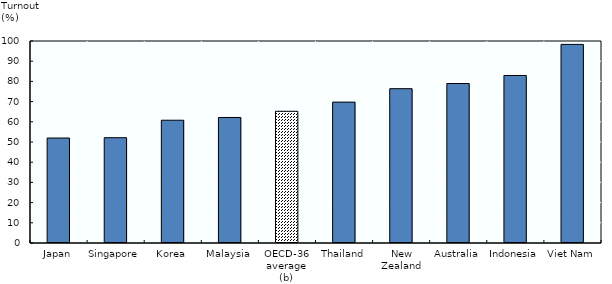
| Category | Series 1 |
|---|---|
| Japan | 51.97 |
| Singapore | 52.13 |
| Korea | 60.78 |
| Malaysia | 62.14 |
| OECD-36 average (b) | 65.2 |
| Thailand | 69.75 |
| New Zealand | 76.4 |
| Australia | 78.96 |
| Indonesia | 82.93 |
| Viet Nam | 98.32 |